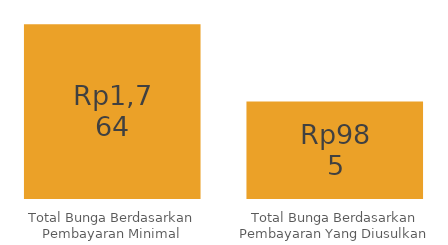
| Category | Series 0 |
|---|---|
| Total Bunga Berdasarkan Pembayaran Minimal | 1763.952 |
| Total Bunga Berdasarkan Pembayaran Yang Diusulkan | 984.811 |